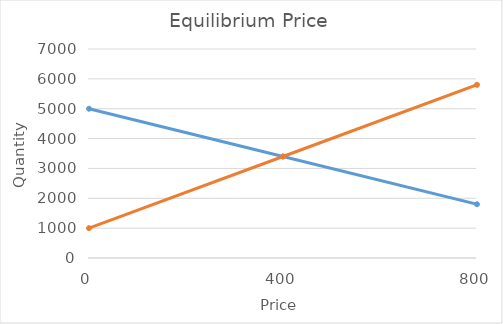
| Category | Series 0 | Series 1 |
|---|---|---|
| 0.0 | 5000 | 1000 |
| 400.0 | 3400 | 3400 |
| 800.0 | 1800 | 5800 |